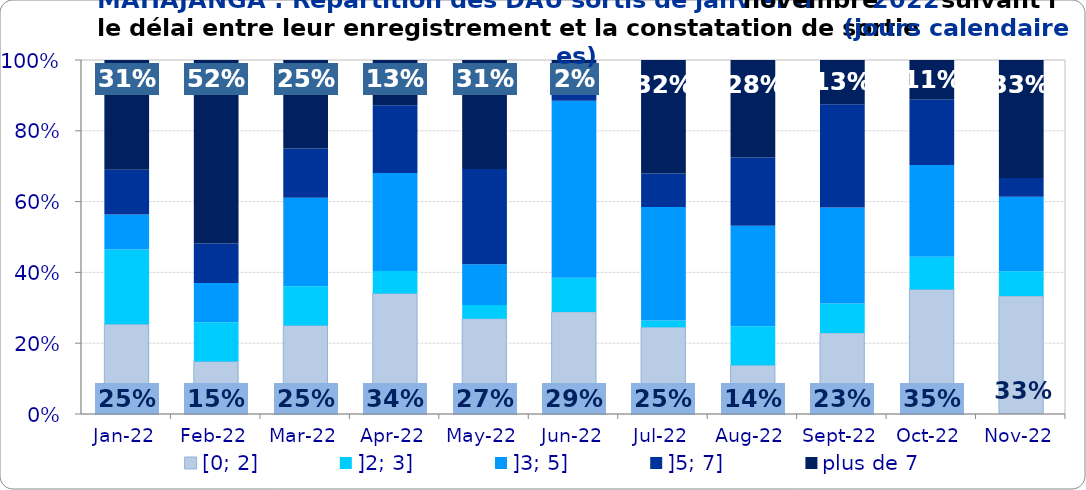
| Category | [0; 2] | ]2; 3] | ]3; 5] | ]5; 7] | plus de 7 |
|---|---|---|---|---|---|
| 2022-01-01 | 0.254 | 0.211 | 0.099 | 0.127 | 0.31 |
| 2022-02-01 | 0.148 | 0.111 | 0.111 | 0.111 | 0.519 |
| 2022-03-01 | 0.25 | 0.111 | 0.25 | 0.139 | 0.25 |
| 2022-04-01 | 0.34 | 0.064 | 0.277 | 0.191 | 0.128 |
| 2022-05-01 | 0.269 | 0.038 | 0.115 | 0.269 | 0.308 |
| 2022-06-01 | 0.288 | 0.096 | 0.5 | 0.096 | 0.019 |
| 2022-07-01 | 0.245 | 0.019 | 0.321 | 0.094 | 0.321 |
| 2022-08-01 | 0.138 | 0.11 | 0.284 | 0.193 | 0.275 |
| 2022-09-01 | 0.229 | 0.083 | 0.271 | 0.292 | 0.125 |
| 2022-10-01 | 0.352 | 0.093 | 0.259 | 0.185 | 0.111 |
| 2022-11-01 | 0.333 | 0.07 | 0.211 | 0.053 | 0.333 |